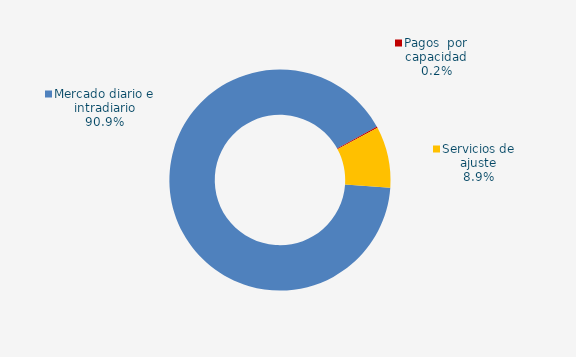
| Category | Series 0 |
|---|---|
| Mercado diario e intradiario | 93.8 |
| Pagos  por capacidad | 0.19 |
| Mecanismo ajuste RD-L 10/2022 | 0 |
| Servicios de ajuste | 9.22 |